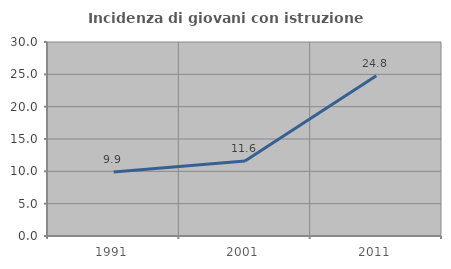
| Category | Incidenza di giovani con istruzione universitaria |
|---|---|
| 1991.0 | 9.903 |
| 2001.0 | 11.591 |
| 2011.0 | 24.774 |